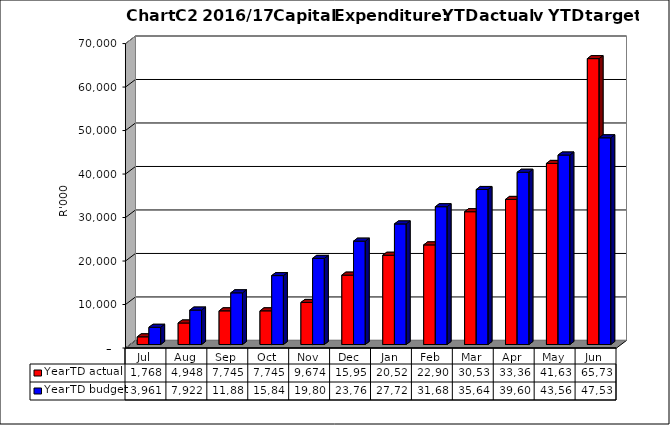
| Category | YearTD actual | YearTD budget |
|---|---|---|
| Jul | 1768200 | 3960831.417 |
| Aug | 4948448 | 7921662.833 |
| Sep | 7745066 | 11882494.25 |
| Oct | 7745067 | 15843325.667 |
| Nov | 9673776 | 19804157.083 |
| Dec | 15954351 | 23764988.5 |
| Jan | 20524876.2 | 27725819.917 |
| Feb | 22905643.58 | 31686651.333 |
| Mar | 30532510.81 | 35647482.75 |
| Apr | 33362082.81 | 39608314.167 |
| May | 41637435.81 | 43569145.583 |
| Jun | 65737186.81 | 47529977 |